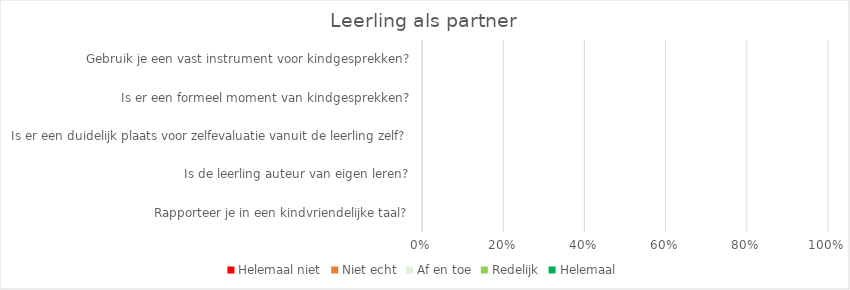
| Category | Helemaal niet | Niet echt | Af en toe | Redelijk | Helemaal |
|---|---|---|---|---|---|
| Rapporteer je in een kindvriendelijke taal? | 0 | 0 | 0 | 0 | 0 |
| Is de leerling auteur van eigen leren? | 0 | 0 | 0 | 0 | 0 |
| Is er een duidelijk plaats voor zelfevaluatie vanuit de leerling zelf? | 0 | 0 | 0 | 0 | 0 |
| Is er een formeel moment van kindgesprekken? | 0 | 0 | 0 | 0 | 0 |
| Gebruik je een vast instrument voor kindgesprekken? | 0 | 0 | 0 | 0 | 0 |